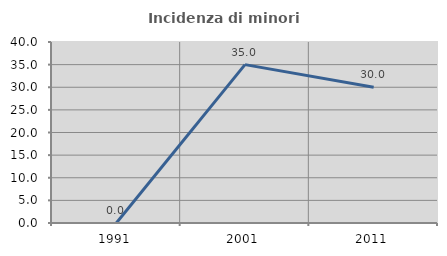
| Category | Incidenza di minori stranieri |
|---|---|
| 1991.0 | 0 |
| 2001.0 | 35 |
| 2011.0 | 30 |